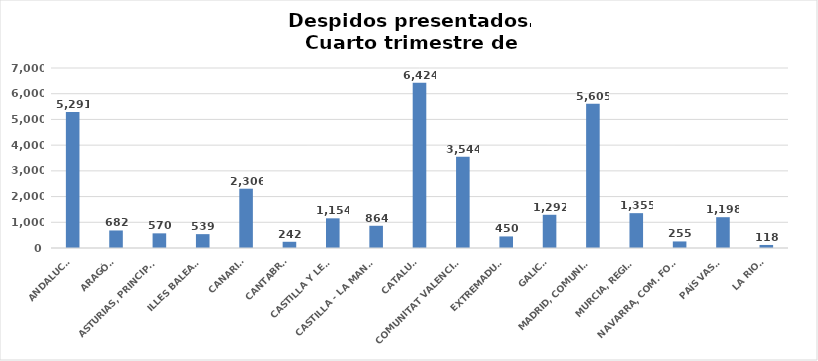
| Category | Series 0 |
|---|---|
| ANDALUCÍA | 5291 |
| ARAGÓN | 682 |
| ASTURIAS, PRINCIPADO | 570 |
| ILLES BALEARS | 539 |
| CANARIAS | 2306 |
| CANTABRIA | 242 |
| CASTILLA Y LEÓN | 1154 |
| CASTILLA - LA MANCHA | 864 |
| CATALUÑA | 6424 |
| COMUNITAT VALENCIANA | 3544 |
| EXTREMADURA | 450 |
| GALICIA | 1292 |
| MADRID, COMUNIDAD | 5605 |
| MURCIA, REGIÓN | 1355 |
| NAVARRA, COM. FORAL | 255 |
| PAÍS VASCO | 1198 |
| LA RIOJA | 118 |